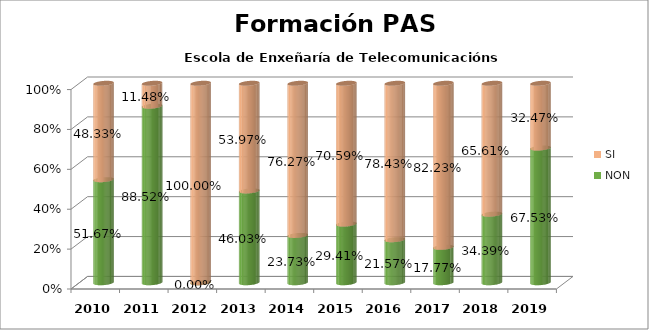
| Category | NON | SI |
|---|---|---|
| 2010.0 | 0.517 | 0.483 |
| 2011.0 | 0.885 | 0.115 |
| 2012.0 | 0 | 1 |
| 2013.0 | 0.46 | 0.54 |
| 2014.0 | 0.237 | 0.763 |
| 2015.0 | 0.294 | 0.706 |
| 2016.0 | 0.216 | 0.784 |
| 2017.0 | 0.178 | 0.822 |
| 2018.0 | 0.344 | 0.656 |
| 2019.0 | 0.675 | 0.325 |